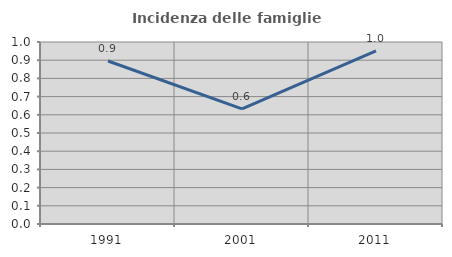
| Category | Incidenza delle famiglie numerose |
|---|---|
| 1991.0 | 0.896 |
| 2001.0 | 0.633 |
| 2011.0 | 0.952 |